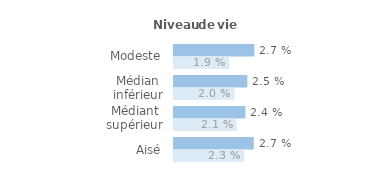
| Category | Series 1 | Series 0 |
|---|---|---|
| Modeste | 0.027 | 0.019 |
| Médian inférieur | 0.025 | 0.02 |
| Médiant supérieur | 0.024 | 0.021 |
| Aisé | 0.027 | 0.023 |